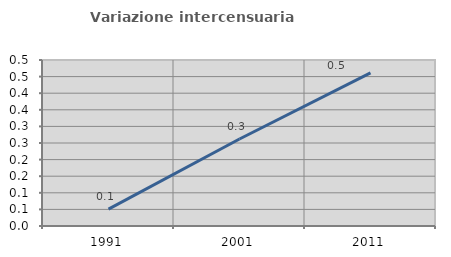
| Category | Variazione intercensuaria annua |
|---|---|
| 1991.0 | 0.051 |
| 2001.0 | 0.262 |
| 2011.0 | 0.461 |